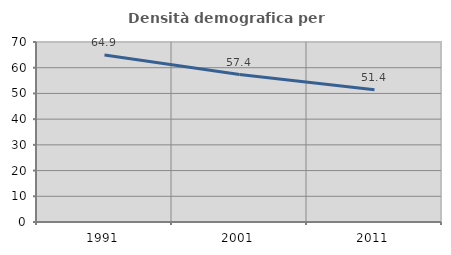
| Category | Densità demografica |
|---|---|
| 1991.0 | 64.932 |
| 2001.0 | 57.361 |
| 2011.0 | 51.393 |